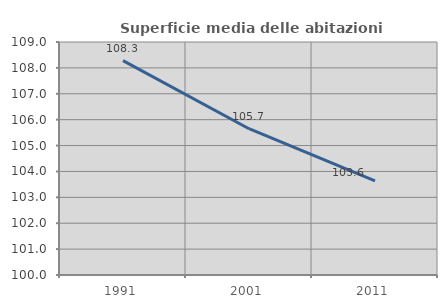
| Category | Superficie media delle abitazioni occupate |
|---|---|
| 1991.0 | 108.28 |
| 2001.0 | 105.65 |
| 2011.0 | 103.632 |